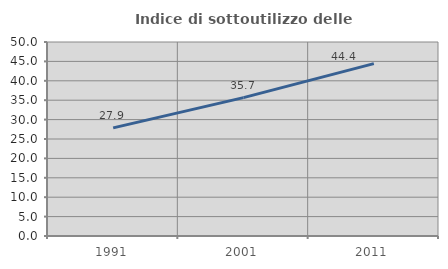
| Category | Indice di sottoutilizzo delle abitazioni  |
|---|---|
| 1991.0 | 27.877 |
| 2001.0 | 35.657 |
| 2011.0 | 44.415 |